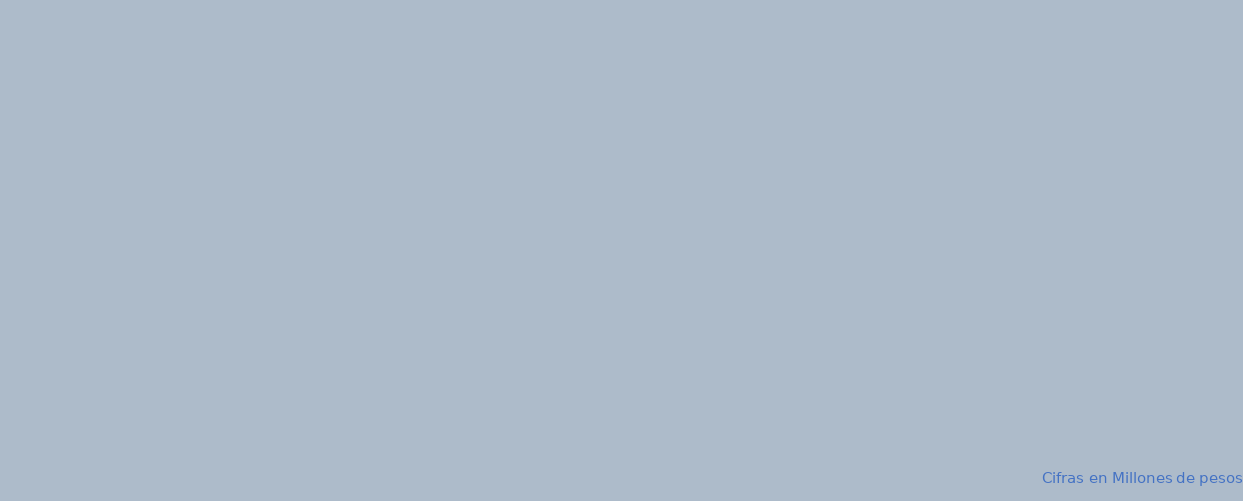
| Category | APROPIACION | COMPROMISOS |  OBLIGACIONES |  PAGOS |
|---|---|---|---|---|
| A-FUNCIONAMIENTO | 99785.985 | 15503.559 | 5019.548 | 4037.367 |
| B-SERVICIO DE LA DEUDA PÚBLICA | 1167604.335 | 0 | 0 | 0 |
| C- INVERSION | 4505182.025 | 4278691.961 | 442970.109 | 442928.193 |